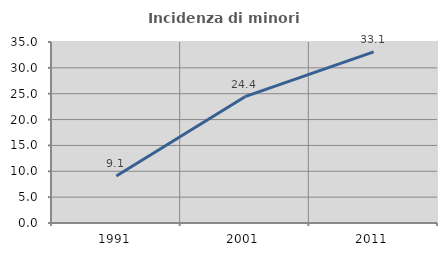
| Category | Incidenza di minori stranieri |
|---|---|
| 1991.0 | 9.091 |
| 2001.0 | 24.432 |
| 2011.0 | 33.083 |